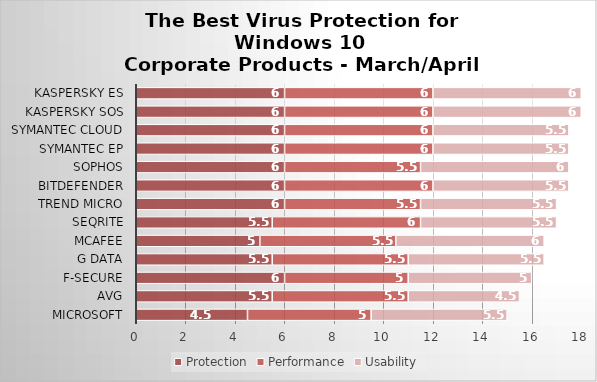
| Category | Protection | Performance | Usability |
|---|---|---|---|
| Microsoft | 4.5 | 5 | 5.5 |
| AVG | 5.5 | 5.5 | 4.5 |
| F-Secure | 6 | 5 | 5 |
| G Data | 5.5 | 5.5 | 5.5 |
| McAfee | 5 | 5.5 | 6 |
| Seqrite | 5.5 | 6 | 5.5 |
| Trend Micro | 6 | 5.5 | 5.5 |
| Bitdefender | 6 | 6 | 5.5 |
| Sophos | 6 | 5.5 | 6 |
| Symantec EP | 6 | 6 | 5.5 |
| Symantec Cloud | 6 | 6 | 5.5 |
| Kaspersky SOS | 6 | 6 | 6 |
| Kaspersky ES | 6 | 6 | 6 |